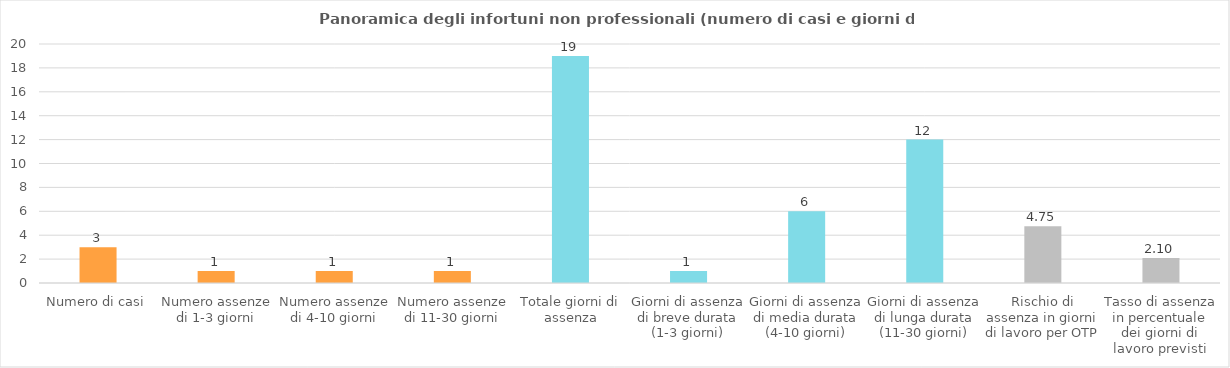
| Category | Infortunio non professionale  |
|---|---|
| Numero di casi | 3 |
| Numero assenze di 1-3 giorni | 1 |
| Numero assenze di 4-10 giorni | 1 |
| Numero assenze di 11-30 giorni | 1 |
| Totale giorni di assenza | 19 |
| Giorni di assenza di breve durata (1-3 giorni) | 1 |
| Giorni di assenza di media durata (4-10 giorni) | 6 |
| Giorni di assenza di lunga durata (11-30 giorni) | 12 |
| Rischio di assenza in giorni di lavoro per OTP | 4.75 |
| Tasso di assenza in percentuale dei giorni di lavoro previsti | 2.102 |